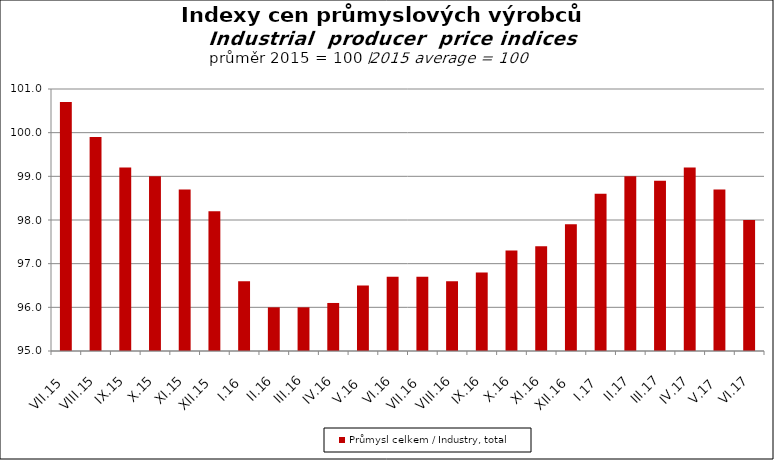
| Category | Průmysl celkem / Industry, total |
|---|---|
| VII.15 | 100.7 |
| VIII.15 | 99.9 |
| IX.15 | 99.2 |
| X.15 | 99 |
| XI.15 | 98.7 |
| XII.15 | 98.2 |
| I.16 | 96.6 |
| II.16 | 96 |
| III.16 | 96 |
| IV.16 | 96.1 |
| V.16 | 96.5 |
| VI.16 | 96.7 |
| VII.16 | 96.7 |
| VIII.16 | 96.6 |
| IX.16 | 96.8 |
| X.16 | 97.3 |
| XI.16 | 97.4 |
| XII.16 | 97.9 |
| I.17 | 98.6 |
| II.17 | 99 |
| III.17 | 98.9 |
| IV.17 | 99.2 |
| V.17 | 98.7 |
| VI.17 | 98 |